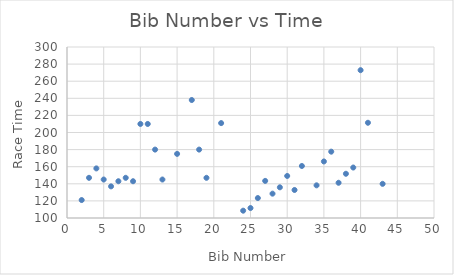
| Category | Series 0 |
|---|---|
| 24.0 | 108.56 |
| 25.0 | 111.64 |
| 2.0 | 121 |
| 26.0 | 123.33 |
| 28.0 | 128.48 |
| 31.0 | 132.77 |
| 29.0 | 135.89 |
| 6.0 | 137 |
| 34.0 | 138.21 |
| 43.0 | 139.95 |
| 37.0 | 141.2 |
| 9.0 | 143 |
| 7.0 | 143 |
| 27.0 | 143.39 |
| 13.0 | 145 |
| 5.0 | 145 |
| 3.0 | 147 |
| 19.0 | 147 |
| 8.0 | 147 |
| 30.0 | 149.17 |
| 38.0 | 151.73 |
| 4.0 | 158 |
| 39.0 | 159.03 |
| 32.0 | 160.83 |
| 35.0 | 166.14 |
| 15.0 | 175 |
| 36.0 | 177.59 |
| 12.0 | 180 |
| 18.0 | 180 |
| nan | 201 |
| nan | 204.7 |
| 11.0 | 210 |
| 10.0 | 210 |
| 21.0 | 211 |
| 41.0 | 211.39 |
| 17.0 | 238 |
| 40.0 | 272.89 |